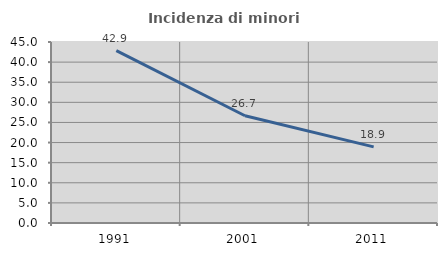
| Category | Incidenza di minori stranieri |
|---|---|
| 1991.0 | 42.857 |
| 2001.0 | 26.667 |
| 2011.0 | 18.919 |